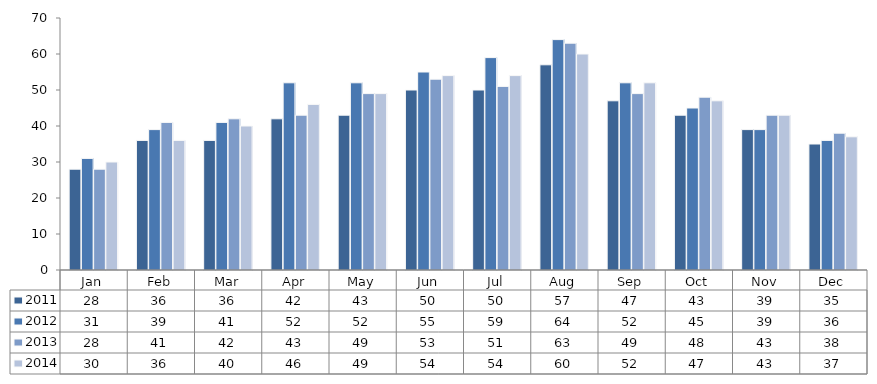
| Category | 2011 | 2012 | 2013 | 2014 |
|---|---|---|---|---|
| Jan | 28 | 31 | 28 | 30 |
| Feb | 36 | 39 | 41 | 36 |
| Mar | 36 | 41 | 42 | 40 |
| Apr | 42 | 52 | 43 | 46 |
| May | 43 | 52 | 49 | 49 |
| Jun | 50 | 55 | 53 | 54 |
| Jul | 50 | 59 | 51 | 54 |
| Aug | 57 | 64 | 63 | 60 |
| Sep | 47 | 52 | 49 | 52 |
| Oct | 43 | 45 | 48 | 47 |
| Nov | 39 | 39 | 43 | 43 |
| Dec | 35 | 36 | 38 | 37 |